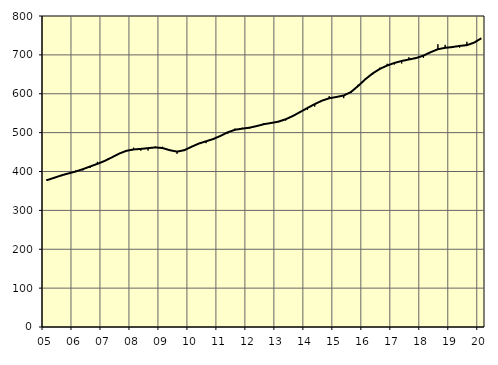
| Category | Trend | Originalvärden |
|---|---|---|
| 5.0 | 377.4 | 380.2 |
| nan | 383.57 | 381.1 |
| 6.0 | 389.87 | 387.8 |
| 6.0 | 394.97 | 395.4 |
| 6.0 | 399.89 | 402.6 |
| nan | 406 | 402.6 |
| 7.0 | 412.91 | 409.2 |
| 7.0 | 419.62 | 424.9 |
| 7.0 | 427.11 | 426 |
| nan | 436.24 | 434.7 |
| 8.0 | 445.91 | 445.3 |
| 8.0 | 453.18 | 452 |
| 8.0 | 456.72 | 461.2 |
| nan | 458.16 | 453.5 |
| 9.0 | 460.04 | 453.9 |
| 9.0 | 461.97 | 464.3 |
| 9.0 | 460.33 | 463.7 |
| nan | 454.79 | 453 |
| 10.0 | 451.14 | 445.4 |
| 10.0 | 454.8 | 457.6 |
| 10.0 | 463.69 | 462.6 |
| nan | 471.79 | 473.6 |
| 11.0 | 477.68 | 472.9 |
| 11.0 | 483.56 | 483 |
| 11.0 | 491.65 | 493.5 |
| nan | 500.97 | 497 |
| 12.0 | 507.32 | 510.6 |
| 12.0 | 510.25 | 512.5 |
| 12.0 | 512.7 | 510.5 |
| nan | 516.91 | 517.2 |
| 13.0 | 521.76 | 524.5 |
| 13.0 | 524.86 | 526.5 |
| 13.0 | 528.27 | 529.7 |
| nan | 534.46 | 531.2 |
| 14.0 | 542.94 | 544 |
| 14.0 | 553.12 | 554.4 |
| 14.0 | 563.44 | 558.4 |
| nan | 573.33 | 566.9 |
| 15.0 | 582.22 | 583.3 |
| 15.0 | 588.42 | 593.9 |
| 15.0 | 591.71 | 589.4 |
| nan | 595.46 | 588.7 |
| 16.0 | 604.5 | 602 |
| 16.0 | 620.13 | 623.3 |
| 16.0 | 637.56 | 637.6 |
| nan | 652.36 | 649.5 |
| 17.0 | 664.06 | 667.1 |
| 17.0 | 672.58 | 677.2 |
| 17.0 | 679.18 | 675.3 |
| nan | 684.36 | 677.8 |
| 18.0 | 688.12 | 693.8 |
| 18.0 | 691.93 | 694 |
| 18.0 | 698.08 | 692.3 |
| nan | 706.99 | 705.4 |
| 19.0 | 714.5 | 727.3 |
| 19.0 | 718.18 | 725.7 |
| 19.0 | 720.15 | 718.2 |
| nan | 723.07 | 718.6 |
| 20.0 | 725.06 | 733.6 |
| 20.0 | 731.49 | 730.8 |
| 20.0 | 742.78 | 742.7 |